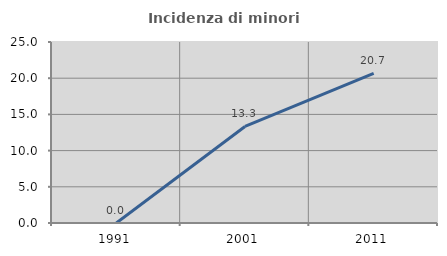
| Category | Incidenza di minori stranieri |
|---|---|
| 1991.0 | 0 |
| 2001.0 | 13.333 |
| 2011.0 | 20.661 |